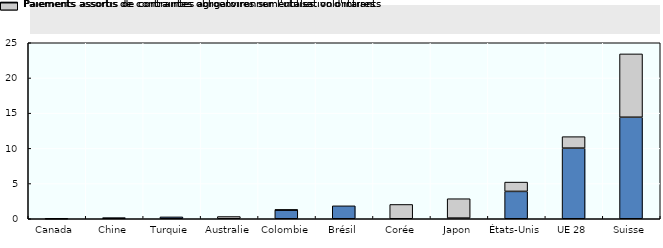
| Category | Paiements assortis de contraintes obligatoires sur l'utilisation d'intrants | Paiements assortis de contraintes agroenvironnementales volontaires |
|---|---|---|
| Canada | 0 | 0 |
| Chine | 0.163 | 0 |
| Turquie | 0.266 | 0 |
| Australie | 0 | 0.317 |
| Colombie | 1.249 | 0.003 |
| Brésil | 1.837 | 0 |
| Corée | 0 | 2.031 |
| Japon | 0.092 | 2.755 |
| États-Unis | 3.887 | 1.322 |
| UE 28 | 10.032 | 1.631 |
| Suisse | 14.422 | 8.994 |